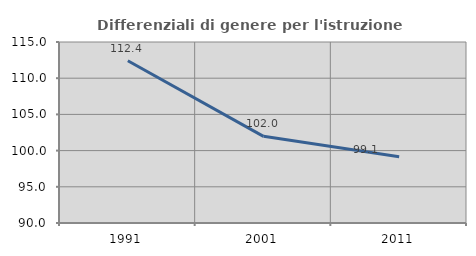
| Category | Differenziali di genere per l'istruzione superiore |
|---|---|
| 1991.0 | 112.414 |
| 2001.0 | 101.967 |
| 2011.0 | 99.138 |